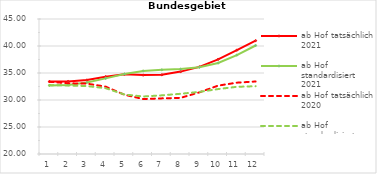
| Category | ab Hof tatsächlich 2021 | ab Hof standardisiert 2021 | ab Hof tatsächlich 2020 | ab Hof standardisiert 2020 |
|---|---|---|---|---|
| 0 | 33.419 | 32.688 | 33.373 | 32.76 |
| 1 | 33.44 | 32.784 | 33.1 | 32.69 |
| 2 | 33.692 | 33.261 | 33.031 | 32.582 |
| 3 | 34.318 | 34.002 | 32.474 | 32.189 |
| 4 | 34.746 | 34.816 | 30.983 | 31.024 |
| 5 | 34.61 | 35.382 | 30.177 | 30.646 |
| 6 | 34.667 | 35.585 | 30.301 | 30.864 |
| 7 | 35.258 | 35.724 | 30.396 | 31.152 |
| 8 | 36.14 | 36.078 | 31.415 | 31.501 |
| 9 | 37.531 | 36.844 | 32.662 | 32.024 |
| 10 | 39.229 | 38.322 | 33.209 | 32.444 |
| 11 | 40.992 | 40.094 | 33.428 | 32.554 |